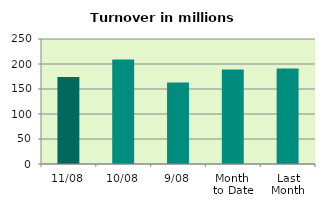
| Category | Series 0 |
|---|---|
| 11/08 | 174.227 |
| 10/08 | 209.13 |
| 9/08 | 162.856 |
| Month 
to Date | 189.221 |
| Last
Month | 191.038 |